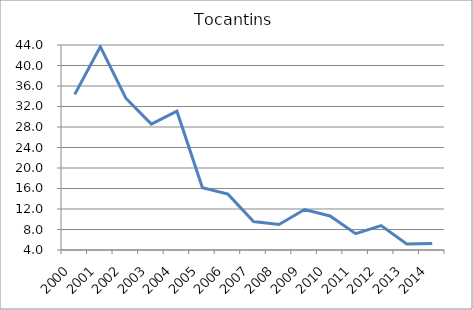
| Category | Tocantins |
|---|---|
| 2000.0 | 34.373 |
| 2001.0 | 43.673 |
| 2002.0 | 33.613 |
| 2003.0 | 28.562 |
| 2004.0 | 31.081 |
| 2005.0 | 16.147 |
| 2006.0 | 14.904 |
| 2007.0 | 9.569 |
| 2008.0 | 8.983 |
| 2009.0 | 11.892 |
| 2010.0 | 10.636 |
| 2011.0 | 7.192 |
| 2012.0 | 8.757 |
| 2013.0 | 5.184 |
| 2014.0 | 5.261 |